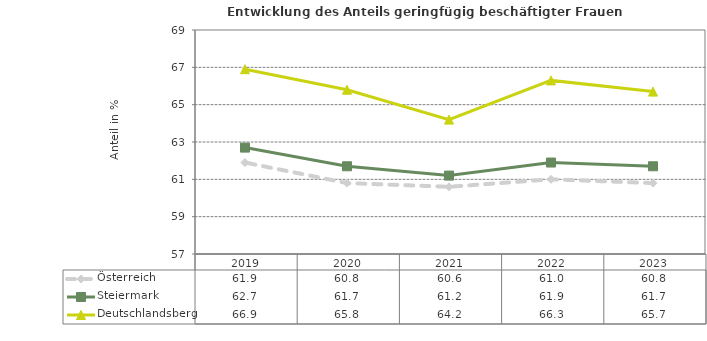
| Category | Österreich | Steiermark | Deutschlandsberg |
|---|---|---|---|
| 2023.0 | 60.8 | 61.7 | 65.7 |
| 2022.0 | 61 | 61.9 | 66.3 |
| 2021.0 | 60.6 | 61.2 | 64.2 |
| 2020.0 | 60.8 | 61.7 | 65.8 |
| 2019.0 | 61.9 | 62.7 | 66.9 |